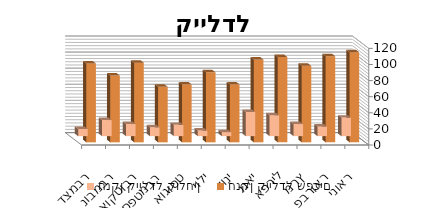
| Category | חנקן קיילדל קולחין | חנקן קיילדל שפכים |
|---|---|---|
| ינואר | 23 | 112 |
| פברואר | 12 | 107 |
| מרץ | 15 | 95 |
| אפריל | 26 | 106 |
| מאי | 30 | 103 |
| יוני | 5 | 72 |
| יולי | 7 | 87 |
| אוגוסט | 14 | 72 |
| ספטמבר | 11 | 69 |
| אוקטובר | 15 | 99 |
| נובמבר | 20 | 83 |
| דצמבר | 9 | 98 |